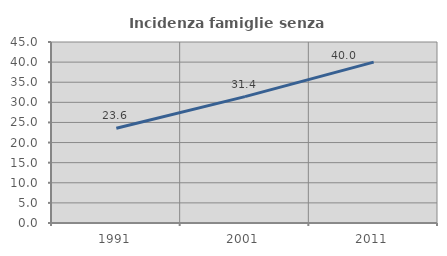
| Category | Incidenza famiglie senza nuclei |
|---|---|
| 1991.0 | 23.573 |
| 2001.0 | 31.421 |
| 2011.0 | 40 |